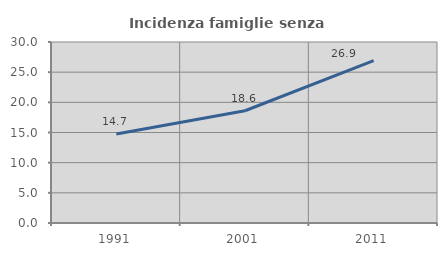
| Category | Incidenza famiglie senza nuclei |
|---|---|
| 1991.0 | 14.744 |
| 2001.0 | 18.605 |
| 2011.0 | 26.904 |